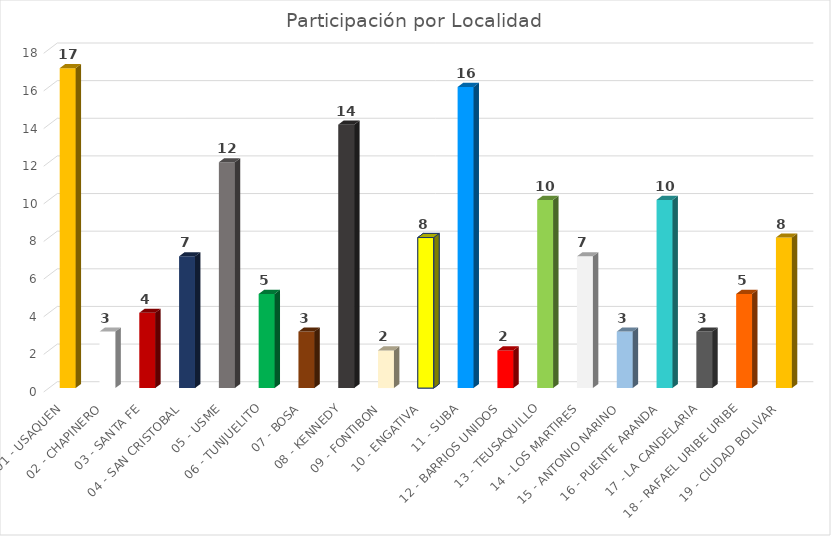
| Category | Peticiones |
|---|---|
| 01 - USAQUEN | 17 |
| 02 - CHAPINERO | 3 |
| 03 - SANTA FE | 4 |
| 04 - SAN CRISTOBAL | 7 |
| 05 - USME | 12 |
| 06 - TUNJUELITO | 5 |
| 07 - BOSA | 3 |
| 08 - KENNEDY | 14 |
| 09 - FONTIBON | 2 |
| 10 - ENGATIVA | 8 |
| 11 - SUBA | 16 |
| 12 - BARRIOS UNIDOS | 2 |
| 13 - TEUSAQUILLO | 10 |
| 14 - LOS MARTIRES | 7 |
| 15 - ANTONIO NARINO | 3 |
| 16 - PUENTE ARANDA | 10 |
| 17 - LA CANDELARIA | 3 |
| 18 - RAFAEL URIBE URIBE | 5 |
| 19 - CIUDAD BOLIVAR | 8 |